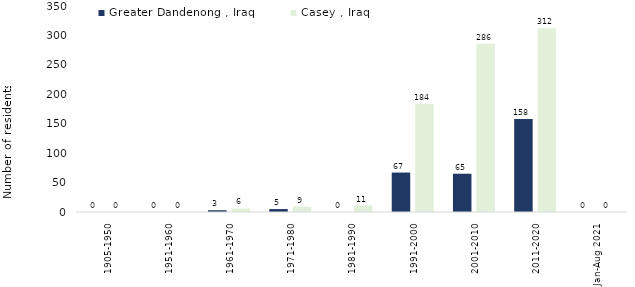
| Category | Greater Dandenong , Iraq | Casey , Iraq |
|---|---|---|
| 1905-1950 | 0 | 0 |
| 1951-1960 | 0 | 0 |
| 1961-1970 | 3 | 6 |
| 1971-1980 | 5 | 9 |
| 1981-1990 | 0 | 11 |
| 1991-2000 | 67 | 184 |
| 2001-2010 | 65 | 286 |
| 2011-2020 | 158 | 312 |
| Jan-Aug 2021 | 0 | 0 |